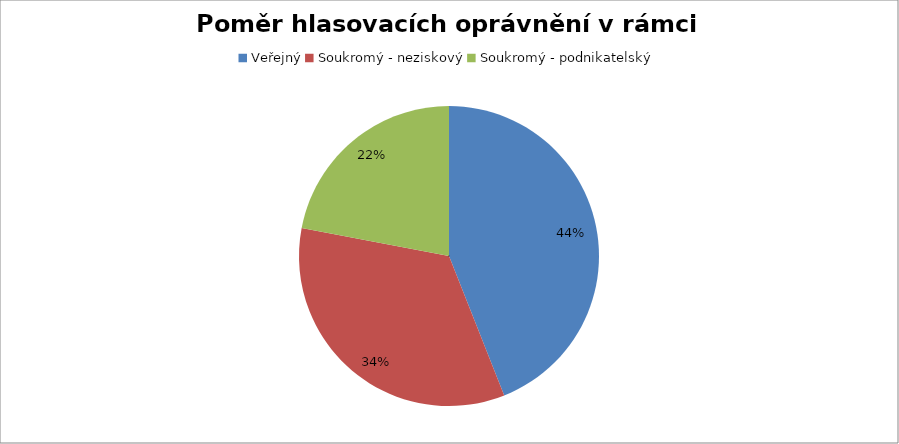
| Category | Series 0 |
|---|---|
| Veřejný | 0.44 |
| Soukromý - neziskový | 0.34 |
| Soukromý - podnikatelský | 0.22 |